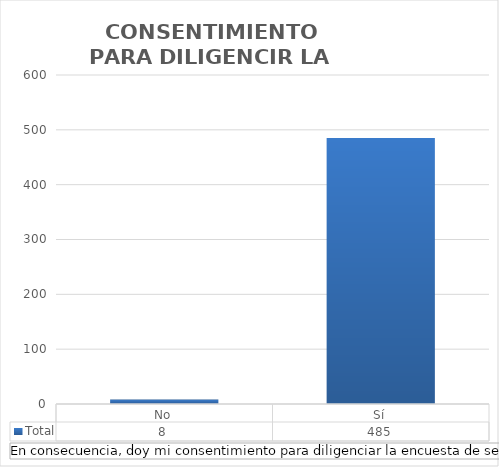
| Category | Total |
|---|---|
| No | 8 |
| Sí | 485 |